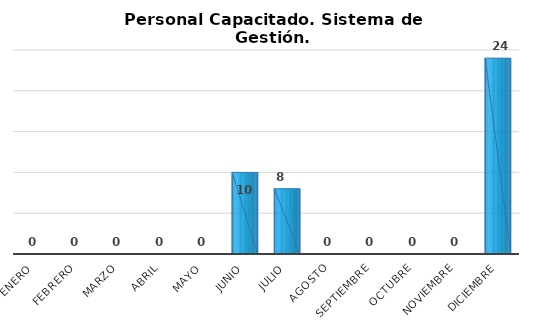
| Category | Personal capacitado/2 |
|---|---|
| Enero | 0 |
| Febrero | 0 |
| Marzo | 0 |
| Abril | 0 |
| Mayo | 0 |
| Junio | 10 |
| Julio | 8 |
| Agosto | 0 |
| Septiembre | 0 |
| Octubre | 0 |
| Noviembre | 0 |
| Diciembre | 24 |